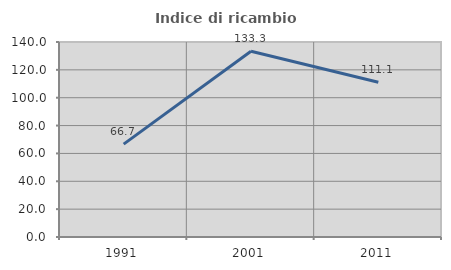
| Category | Indice di ricambio occupazionale  |
|---|---|
| 1991.0 | 66.667 |
| 2001.0 | 133.333 |
| 2011.0 | 111.111 |